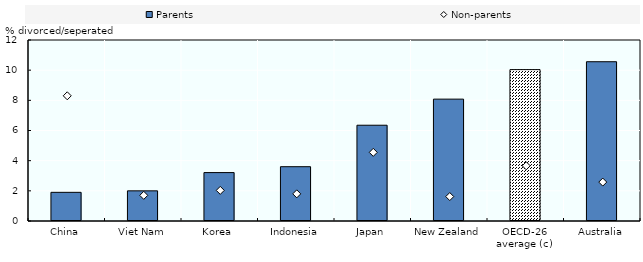
| Category | Parents |
|---|---|
| China | 1.9 |
| Viet Nam | 2 |
| Korea | 3.21 |
| Indonesia | 3.6 |
| Japan | 6.35 |
| New Zealand | 8.08 |
| OECD-26 average (c) | 10.036 |
| Australia | 10.56 |